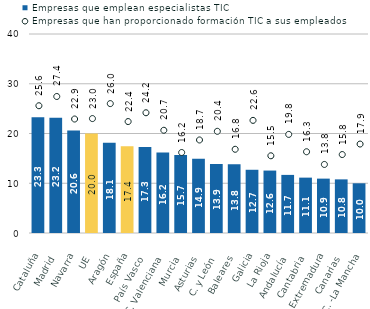
| Category | Empresas que emplean especialistas TIC |
|---|---|
| Cataluña | 23.29 |
| Madrid | 23.16 |
| Navarra | 20.61 |
| UE | 20 |
| Aragón | 18.12 |
| España | 17.44 |
| País Vasco | 17.31 |
| C. Valenciana | 16.16 |
| Murcia | 15.69 |
| Asturias | 14.94 |
| C. y León | 13.87 |
| Baleares | 13.83 |
| Galicia | 12.71 |
| La Rioja | 12.55 |
| Andalucía | 11.68 |
| Cantabria | 11.13 |
| Extremadura | 10.93 |
| Canarias | 10.78 |
| C. -La Mancha | 9.99 |